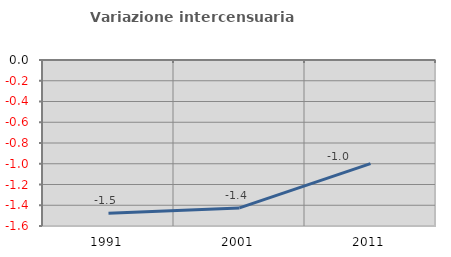
| Category | Variazione intercensuaria annua |
|---|---|
| 1991.0 | -1.478 |
| 2001.0 | -1.426 |
| 2011.0 | -0.999 |